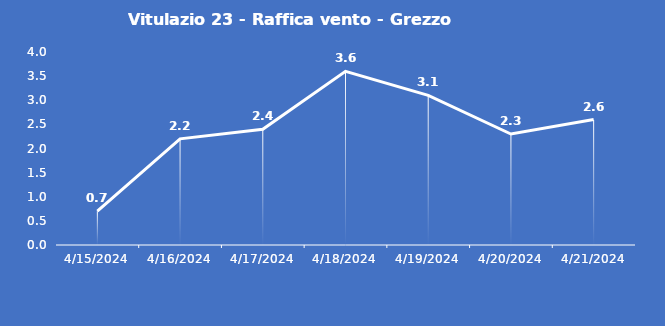
| Category | Vitulazio 23 - Raffica vento - Grezzo (m/s) |
|---|---|
| 4/15/24 | 0.7 |
| 4/16/24 | 2.2 |
| 4/17/24 | 2.4 |
| 4/18/24 | 3.6 |
| 4/19/24 | 3.1 |
| 4/20/24 | 2.3 |
| 4/21/24 | 2.6 |